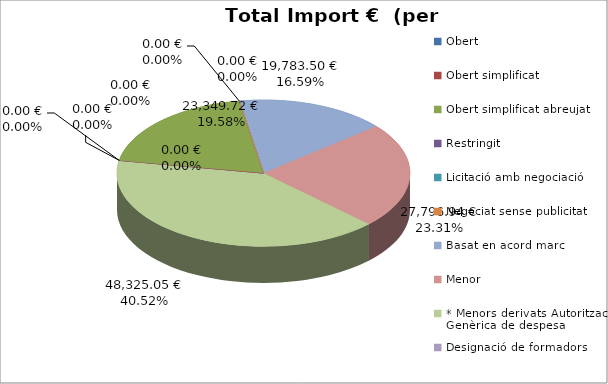
| Category | Total preu              (amb iva) |
|---|---|
| Obert | 0 |
| Obert simplificat | 0 |
| Obert simplificat abreujat | 23349.72 |
| Restringit | 0 |
| Licitació amb negociació | 0 |
| Negociat sense publicitat | 0 |
| Basat en acord marc | 19783.5 |
| Menor | 27796.94 |
| * Menors derivats Autorització Genèrica de despesa | 48325.05 |
| Designació de formadors | 0 |